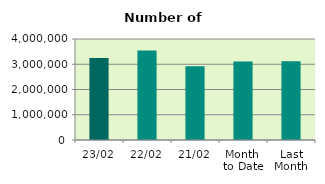
| Category | Series 0 |
|---|---|
| 23/02 | 3251338 |
| 22/02 | 3543594 |
| 21/02 | 2916634 |
| Month 
to Date | 3108675.412 |
| Last
Month | 3115708.381 |